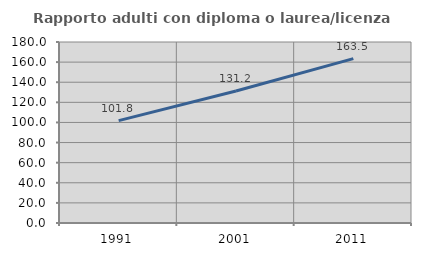
| Category | Rapporto adulti con diploma o laurea/licenza media  |
|---|---|
| 1991.0 | 101.811 |
| 2001.0 | 131.223 |
| 2011.0 | 163.494 |